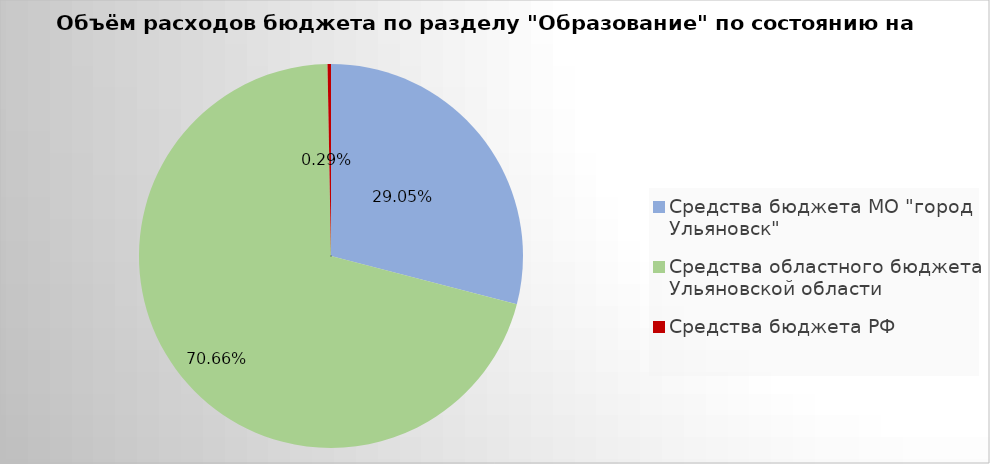
| Category | Series 0 |
|---|---|
| Средства бюджета МО "город Ульяновск" | 1518640.6 |
| Средства областного бюджета Ульяновской области | 3693931.11 |
| Средства бюджета РФ | 15104.07 |